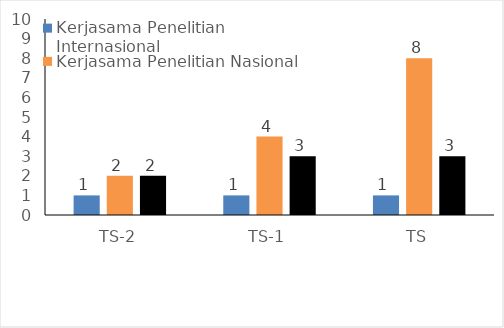
| Category | Kerjasama Penelitian Internasional | Kerjasama Penelitian Nasional | Kerjasama Penelitian Lokal |
|---|---|---|---|
| TS-2 | 1 | 2 | 2 |
| TS-1 | 1 | 4 | 3 |
| TS | 1 | 8 | 3 |